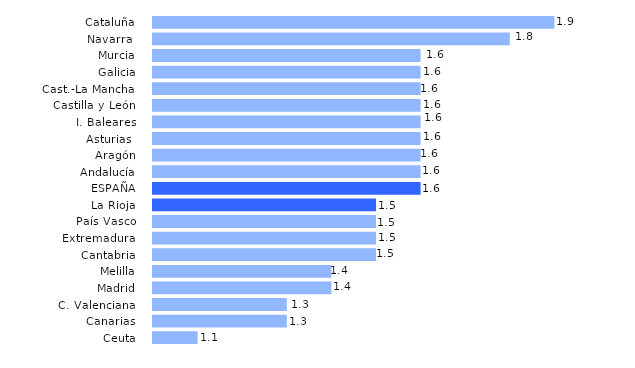
| Category | Series 0 |
|---|---|
| Ceuta | 1.1 |
| Canarias | 1.3 |
| C. Valenciana | 1.3 |
| Madrid | 1.4 |
| Melilla | 1.4 |
| Cantabria | 1.5 |
| Extremadura | 1.5 |
| País Vasco | 1.5 |
| La Rioja | 1.5 |
| ESPAÑA | 1.6 |
| Andalucía | 1.6 |
| Aragón | 1.6 |
| Asturias  | 1.6 |
| I. Baleares | 1.6 |
| Castilla y León | 1.6 |
| Cast.-La Mancha | 1.6 |
| Galicia | 1.6 |
| Murcia | 1.6 |
| Navarra  | 1.8 |
| Cataluña | 1.9 |